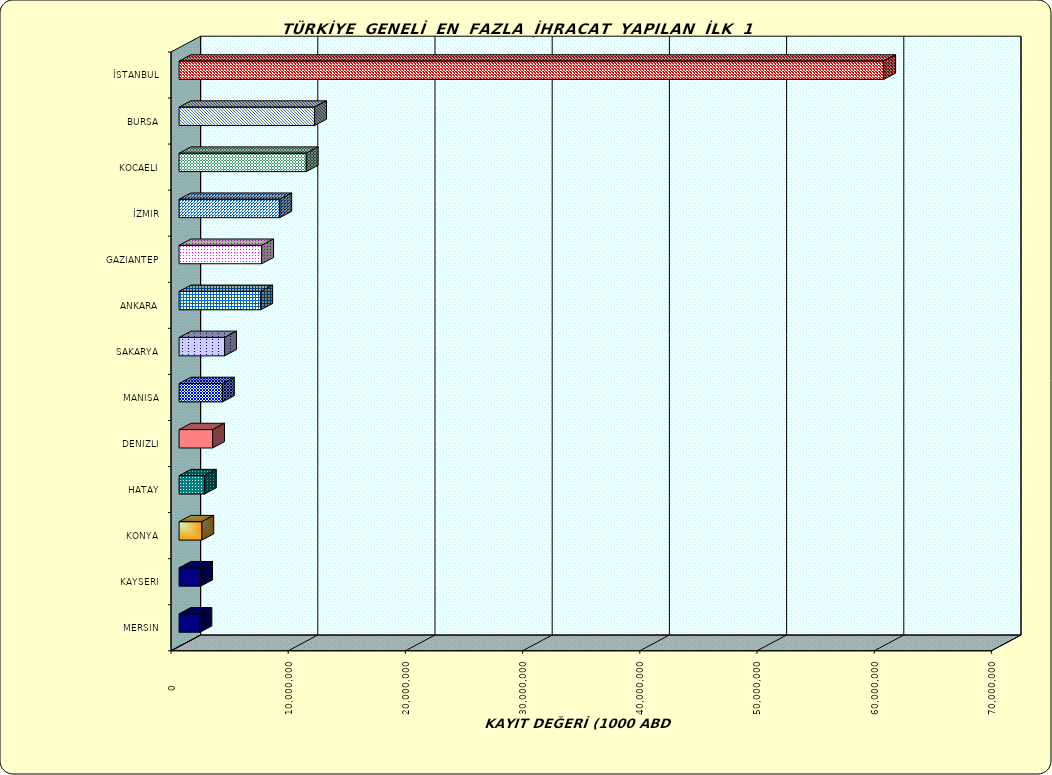
| Category | Series 0 |
|---|---|
| İSTANBUL | 60128483.823 |
| BURSA | 11569076.477 |
| KOCAELI | 10851867.054 |
| İZMIR | 8596730.147 |
| GAZIANTEP | 7051247.363 |
| ANKARA | 6971596.13 |
| SAKARYA | 3887641.219 |
| MANISA | 3703010.378 |
| DENIZLI | 2862737.892 |
| HATAY | 2165244.517 |
| KONYA | 1947554.656 |
| KAYSERI | 1843700.852 |
| MERSIN | 1786677.074 |